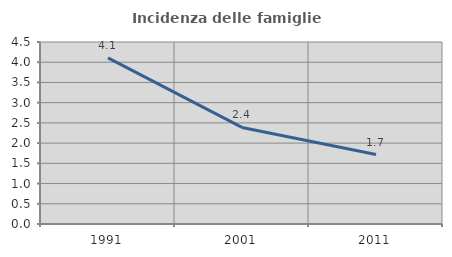
| Category | Incidenza delle famiglie numerose |
|---|---|
| 1991.0 | 4.109 |
| 2001.0 | 2.388 |
| 2011.0 | 1.718 |